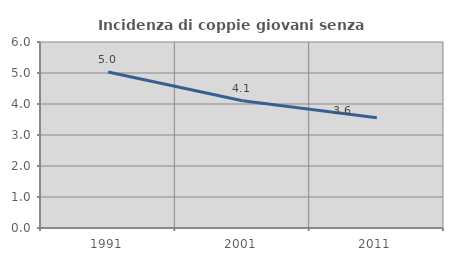
| Category | Incidenza di coppie giovani senza figli |
|---|---|
| 1991.0 | 5.034 |
| 2001.0 | 4.103 |
| 2011.0 | 3.554 |